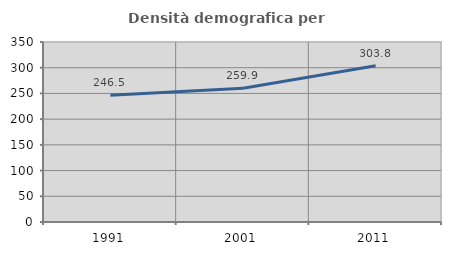
| Category | Densità demografica |
|---|---|
| 1991.0 | 246.478 |
| 2001.0 | 259.93 |
| 2011.0 | 303.791 |